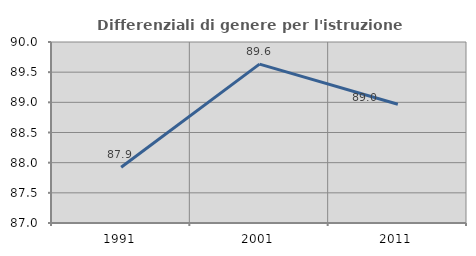
| Category | Differenziali di genere per l'istruzione superiore |
|---|---|
| 1991.0 | 87.925 |
| 2001.0 | 89.633 |
| 2011.0 | 88.969 |